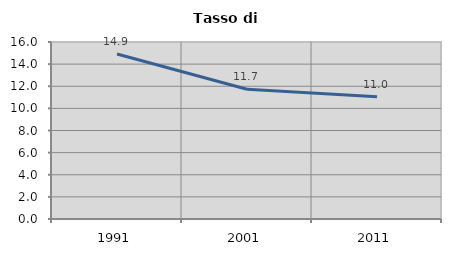
| Category | Tasso di disoccupazione   |
|---|---|
| 1991.0 | 14.909 |
| 2001.0 | 11.735 |
| 2011.0 | 11.045 |